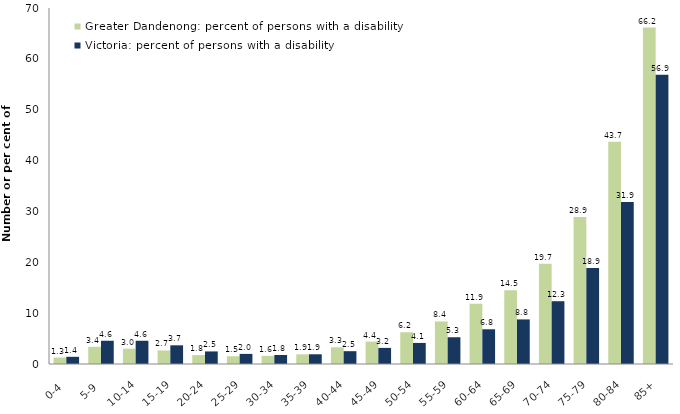
| Category | Greater Dandenong: percent of persons with a disability | Victoria: percent of persons with a disability |
|---|---|---|
| 0-4 | 1.259 | 1.412 |
| 5-9 | 3.376 | 4.571 |
| 10-14 | 3.006 | 4.572 |
| 15-19 | 2.66 | 3.673 |
| 20-24 | 1.751 | 2.472 |
| 25-29 | 1.519 | 1.986 |
| 30-34 | 1.606 | 1.772 |
| 35-39 | 1.895 | 1.911 |
| 40-44 | 3.29 | 2.52 |
| 45-49 | 4.415 | 3.167 |
| 50-54 | 6.236 | 4.141 |
| 55-59 | 8.368 | 5.262 |
| 60-64 | 11.851 | 6.828 |
| 65-69 | 14.491 | 8.765 |
| 70-74 | 19.721 | 12.347 |
| 75-79 | 28.88 | 18.875 |
| 80-84 | 43.684 | 31.866 |
| 85+ | 66.156 | 56.863 |